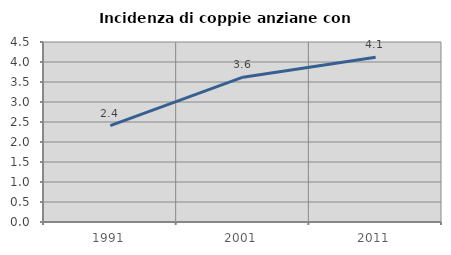
| Category | Incidenza di coppie anziane con figli |
|---|---|
| 1991.0 | 2.41 |
| 2001.0 | 3.62 |
| 2011.0 | 4.118 |